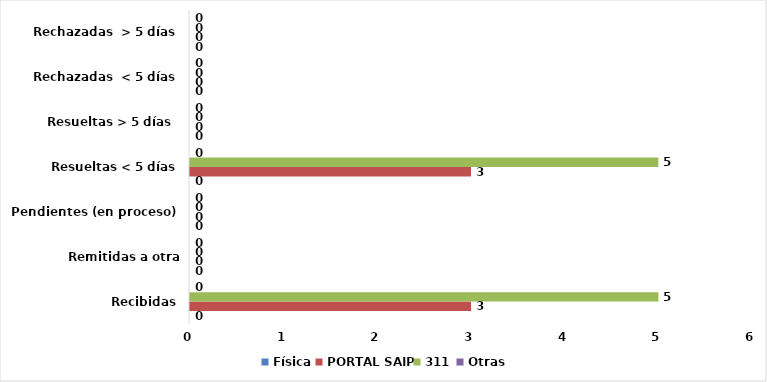
| Category | Física | PORTAL SAIP | 311 | Otras |
|---|---|---|---|---|
| Recibidas | 0 | 3 | 5 | 0 |
| Remitidas a otra institución | 0 | 0 | 0 | 0 |
| Pendientes (en proceso) | 0 | 0 | 0 | 0 |
| Resueltas < 5 días | 0 | 3 | 5 | 0 |
| Resueltas > 5 días  | 0 | 0 | 0 | 0 |
| Rechazadas  < 5 días | 0 | 0 | 0 | 0 |
| Rechazadas  > 5 días | 0 | 0 | 0 | 0 |